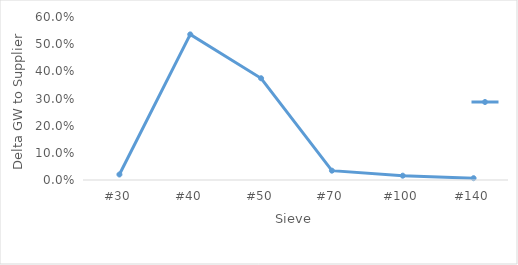
| Category | Series 0 |
|---|---|
| #30 | 0.02 |
| #40 | 0.536 |
| #50 | 0.374 |
| #70 | 0.034 |
| #100 | 0.016 |
| #140 | 0.007 |